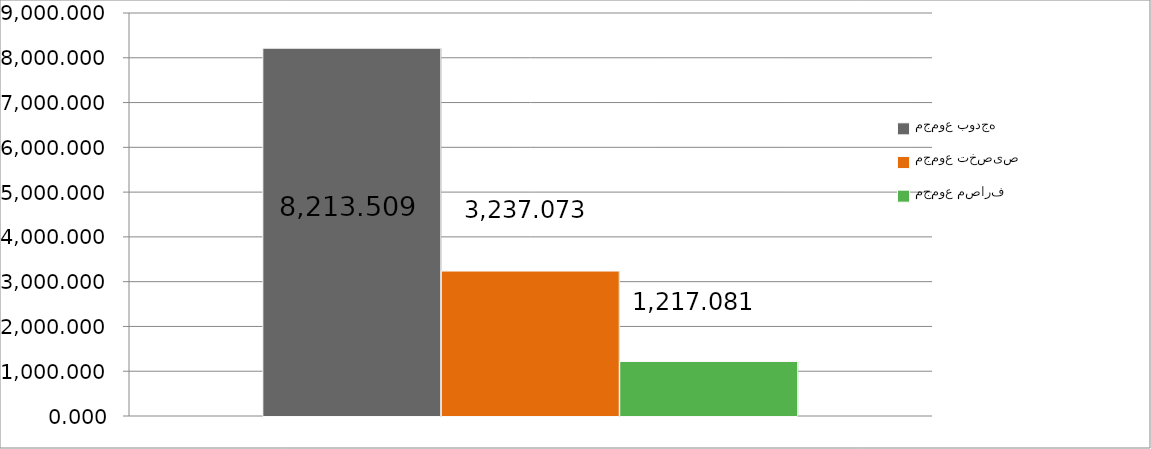
| Category | مجموع بودجه  | مجموع تخصیص | مجموع مصارف |
|---|---|---|---|
| 0 | 8213.509 | 3237.073 | 1217.081 |